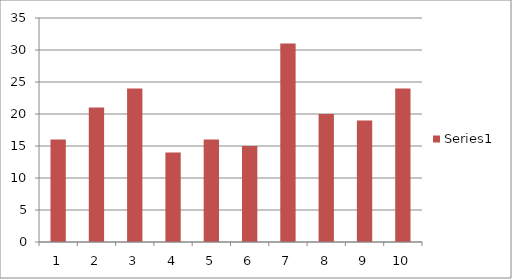
| Category | Series 1 |
|---|---|
| 0 | 16 |
| 1 | 21 |
| 2 | 24 |
| 3 | 14 |
| 4 | 16 |
| 5 | 15 |
| 6 | 31 |
| 7 | 20 |
| 8 | 19 |
| 9 | 24 |